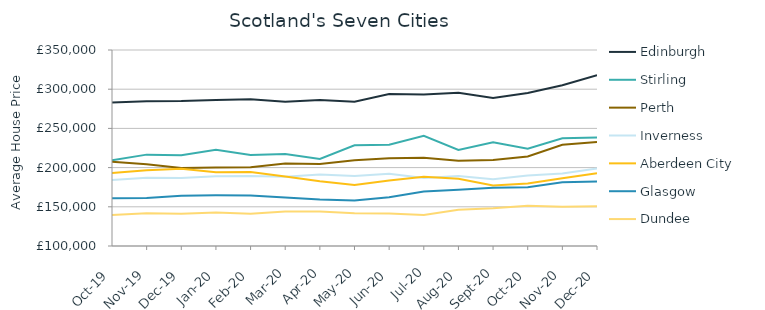
| Category | Edinburgh | Stirling | Perth | Inverness | Aberdeen City | Glasgow | Dundee |
|---|---|---|---|---|---|---|---|
| 2019-10-01 | 283125.207 | 209322.975 | 207431.06 | 184243.481 | 193090.867 | 160878.964 | 139571.373 |
| 2019-11-01 | 284572.509 | 216538.871 | 204303.183 | 187091.243 | 196487.819 | 161183.936 | 141760.279 |
| 2019-12-01 | 284790.145 | 215739.589 | 199556.443 | 186763.031 | 198659.348 | 164024.786 | 141062.207 |
| 2020-01-01 | 286117.238 | 222761.096 | 200264.714 | 189090.615 | 193945.285 | 164630.674 | 142749.094 |
| 2020-02-01 | 287274.628 | 216206.512 | 200565.633 | 189372.315 | 194430.188 | 164322.473 | 141203.594 |
| 2020-03-01 | 283982.854 | 217208.546 | 205225.793 | 188363.596 | 188579.497 | 161978.363 | 144152.801 |
| 2020-04-01 | 286316.265 | 211043.529 | 204722.056 | 191235.289 | 182540.975 | 159245.322 | 143951.935 |
| 2020-05-01 | 284090.876 | 228519.167 | 209388.471 | 189243.419 | 177669.841 | 157965.927 | 141799.66 |
| 2020-06-01 | 294000.712 | 229036.457 | 211969.901 | 192127.859 | 183525.968 | 162306.77 | 141358.367 |
| 2020-07-01 | 293373.267 | 240546.779 | 212714.938 | 186782.244 | 188168.882 | 169522.682 | 139568.747 |
| 2020-08-01 | 295423.081 | 222443.305 | 208638.474 | 189386.424 | 185768.151 | 171605.068 | 146306.036 |
| 2020-09-01 | 288888.827 | 232369.928 | 209768.171 | 185261.956 | 177144.954 | 174304.543 | 148083.061 |
| 2020-10-01 | 295050.756 | 223964.744 | 214285.889 | 189812.819 | 179674.545 | 174912.705 | 151220.533 |
| 2020-11-01 | 305096.074 | 237296.427 | 229131.391 | 192523.685 | 186298.232 | 181199.725 | 150083.986 |
| 2020-12-01 | 317989.061 | 238388.27 | 232744.797 | 198744.881 | 192741.037 | 182403.541 | 150732.489 |